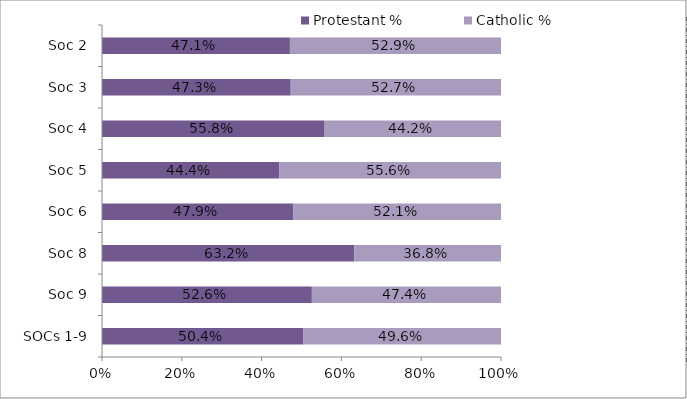
| Category | Protestant | Catholic |
|---|---|---|
| SOCs 1-9 | 0.504 | 0.496 |
| Soc 9 | 0.526 | 0.474 |
| Soc 8 | 0.632 | 0.368 |
| Soc 6 | 0.479 | 0.521 |
| Soc 5 | 0.444 | 0.556 |
| Soc 4 | 0.558 | 0.442 |
| Soc 3 | 0.473 | 0.527 |
| Soc 2 | 0.471 | 0.529 |